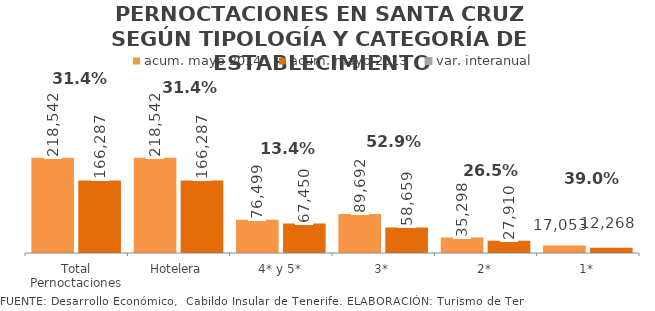
| Category | acum. mayo 2014 | acum. mayo 2013 |
|---|---|---|
| Total Pernoctaciones | 218542 | 166287 |
| Hotelera | 218542 | 166287 |
| 4* y 5* | 76499 | 67450 |
| 3* | 89692 | 58659 |
| 2* | 35298 | 27910 |
| 1* | 17053 | 12268 |